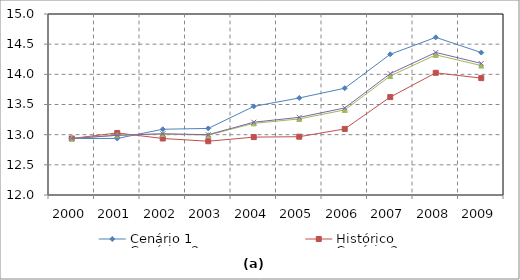
| Category | Cenário 1 | Histórico | Cenários 2  | Cenário 3 |
|---|---|---|---|---|
| 2000.0 | 12.937 | 12.937 | 12.937 | 12.937 |
| 2001.0 | 12.937 | 13.028 | 12.992 | 12.989 |
| 2002.0 | 13.09 | 12.937 | 13.011 | 13.014 |
| 2003.0 | 13.104 | 12.891 | 12.993 | 13 |
| 2004.0 | 13.469 | 12.959 | 13.188 | 13.206 |
| 2005.0 | 13.608 | 12.966 | 13.261 | 13.287 |
| 2006.0 | 13.77 | 13.095 | 13.41 | 13.443 |
| 2007.0 | 14.333 | 13.623 | 13.973 | 14.012 |
| 2008.0 | 14.613 | 14.025 | 14.323 | 14.363 |
| 2009.0 | 14.361 | 13.937 | 14.146 | 14.181 |